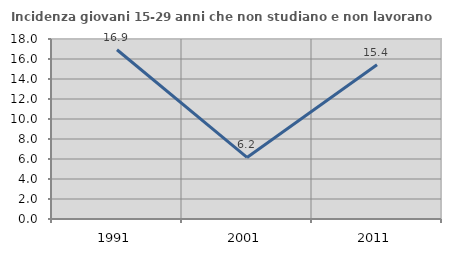
| Category | Incidenza giovani 15-29 anni che non studiano e non lavorano  |
|---|---|
| 1991.0 | 16.923 |
| 2001.0 | 6.154 |
| 2011.0 | 15.429 |